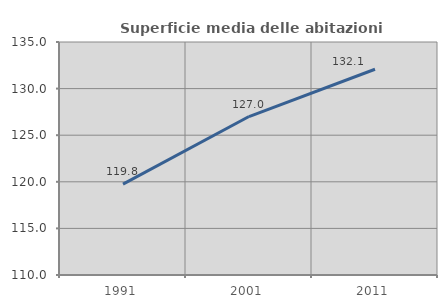
| Category | Superficie media delle abitazioni occupate |
|---|---|
| 1991.0 | 119.756 |
| 2001.0 | 127.003 |
| 2011.0 | 132.075 |